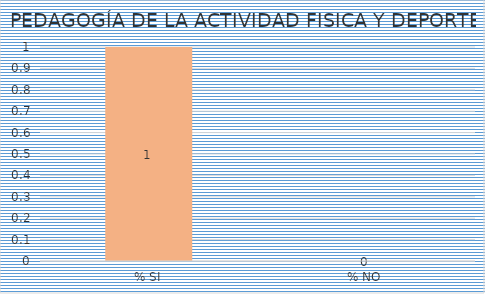
| Category | Series 0 |
|---|---|
| % SI | 1 |
| % NO | 0 |